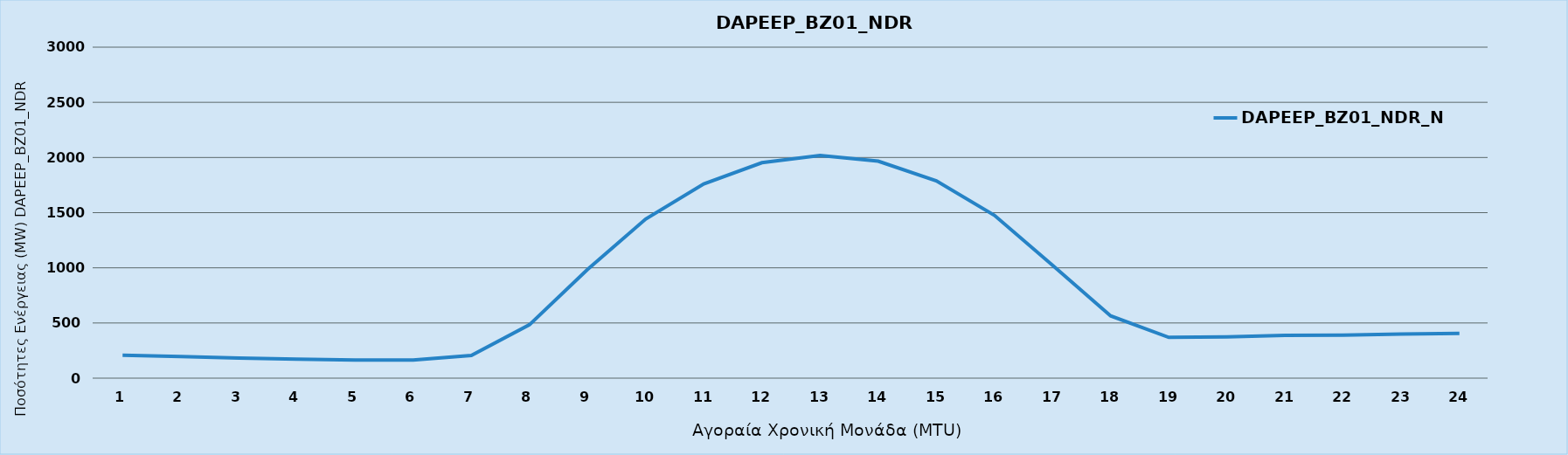
| Category | DAPEEP_BZ01_NDR_N1 |
|---|---|
| 0 | 207 |
| 1 | 195 |
| 2 | 183 |
| 3 | 172 |
| 4 | 165 |
| 5 | 164 |
| 6 | 205 |
| 7 | 484 |
| 8 | 985 |
| 9 | 1442 |
| 10 | 1760 |
| 11 | 1953 |
| 12 | 2019 |
| 13 | 1967 |
| 14 | 1789 |
| 15 | 1476 |
| 16 | 1023 |
| 17 | 564 |
| 18 | 370 |
| 19 | 374 |
| 20 | 387 |
| 21 | 390 |
| 22 | 400 |
| 23 | 406 |